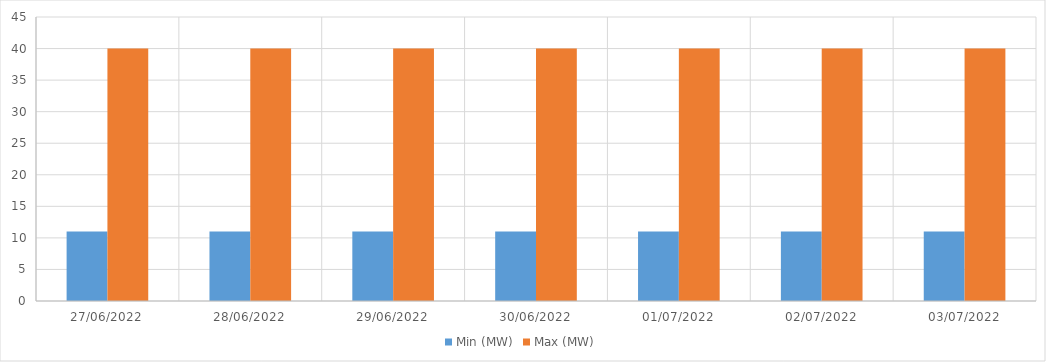
| Category | Min (MW) | Max (MW) |
|---|---|---|
| 27/06/2022 | 11 | 40 |
| 28/06/2022 | 11 | 40 |
| 29/06/2022 | 11 | 40 |
| 30/06/2022 | 11 | 40 |
| 01/07/2022 | 11 | 40 |
| 02/07/2022 | 11 | 40 |
| 03/07/2022 | 11 | 40 |